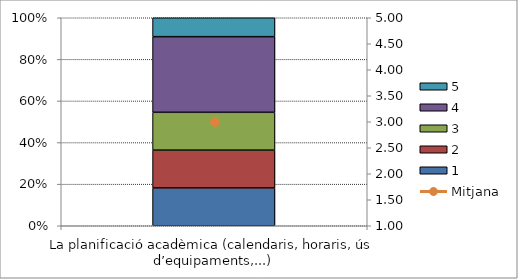
| Category | 1 | 2 | 3 | 4 | 5 |
|---|---|---|---|---|---|
| La planificació acadèmica (calendaris, horaris, ús d’equipaments,...) | 2 | 2 | 2 | 4 | 1 |